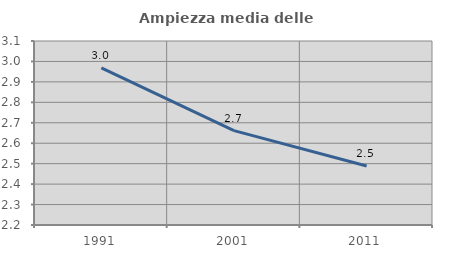
| Category | Ampiezza media delle famiglie |
|---|---|
| 1991.0 | 2.969 |
| 2001.0 | 2.661 |
| 2011.0 | 2.488 |